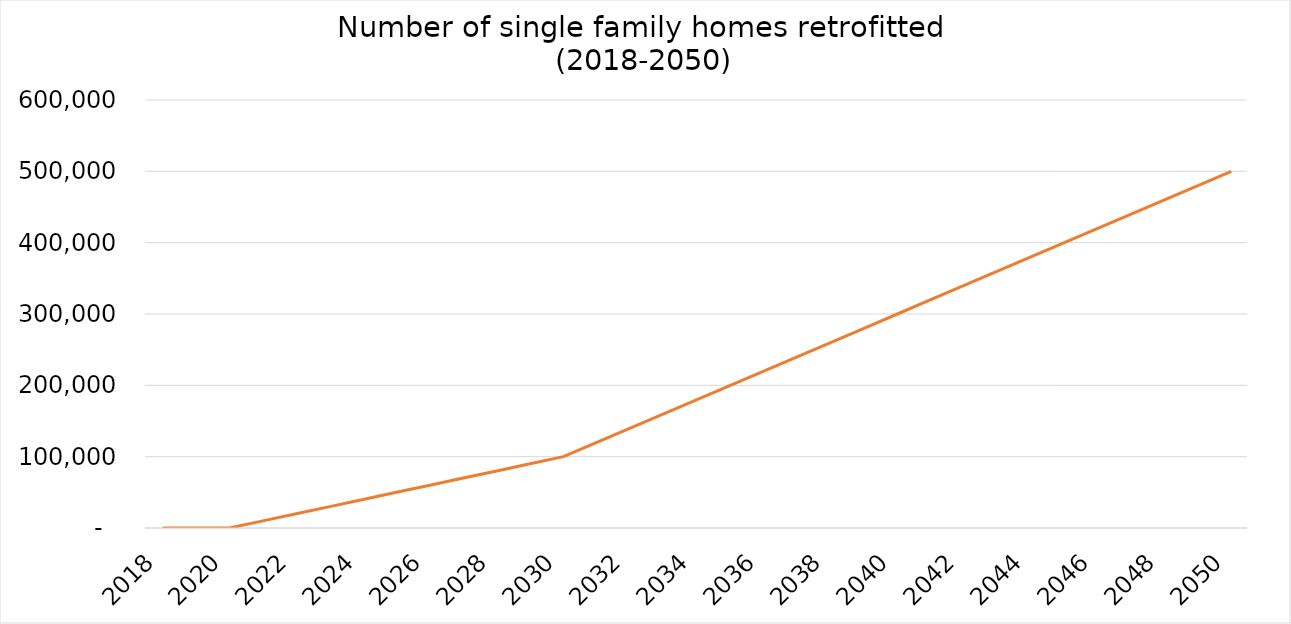
| Category | Number of single family homes retrofitted 
(2018-2050) |
|---|---|
| 2018.0 | 0 |
| 2019.0 | 0 |
| 2020.0 | 0 |
| 2021.0 | 10000 |
| 2022.0 | 20000 |
| 2023.0 | 30000 |
| 2024.0 | 40000 |
| 2025.0 | 50000 |
| 2026.0 | 60000 |
| 2027.0 | 70000 |
| 2028.0 | 80000 |
| 2029.0 | 90000 |
| 2030.0 | 100000 |
| 2031.0 | 120000 |
| 2032.0 | 140000 |
| 2033.0 | 160000 |
| 2034.0 | 180000 |
| 2035.0 | 200000 |
| 2036.0 | 220000 |
| 2037.0 | 240000 |
| 2038.0 | 260000 |
| 2039.0 | 280000 |
| 2040.0 | 300000 |
| 2041.0 | 320000 |
| 2042.0 | 340000 |
| 2043.0 | 360000 |
| 2044.0 | 380000 |
| 2045.0 | 400000 |
| 2046.0 | 420000 |
| 2047.0 | 440000 |
| 2048.0 | 460000 |
| 2049.0 | 480000 |
| 2050.0 | 500000 |